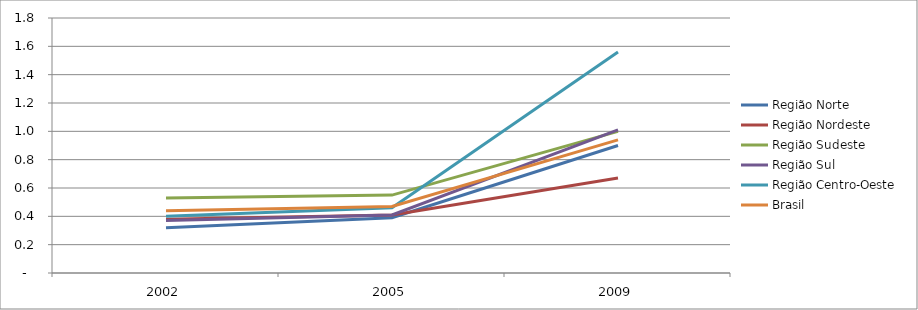
| Category | Região Norte | Região Nordeste | Região Sudeste | Região Sul | Região Centro-Oeste | Brasil |
|---|---|---|---|---|---|---|
| 2002.0 | 0.32 | 0.38 | 0.53 | 0.37 | 0.4 | 0.44 |
| 2005.0 | 0.39 | 0.41 | 0.55 | 0.41 | 0.46 | 0.47 |
| 2009.0 | 0.9 | 0.67 | 1 | 1.01 | 1.56 | 0.94 |